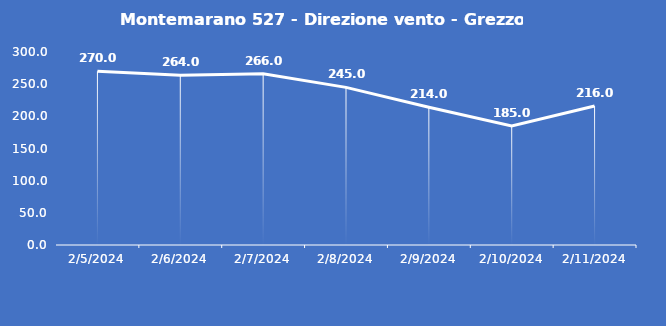
| Category | Montemarano 527 - Direzione vento - Grezzo (°N) |
|---|---|
| 2/5/24 | 270 |
| 2/6/24 | 264 |
| 2/7/24 | 266 |
| 2/8/24 | 245 |
| 2/9/24 | 214 |
| 2/10/24 | 185 |
| 2/11/24 | 216 |